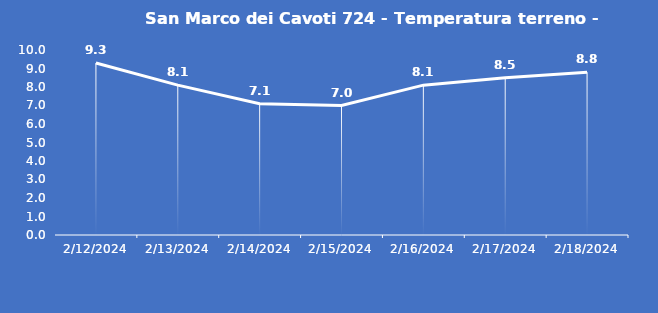
| Category | San Marco dei Cavoti 724 - Temperatura terreno - Grezzo (°C) |
|---|---|
| 2/12/24 | 9.3 |
| 2/13/24 | 8.1 |
| 2/14/24 | 7.1 |
| 2/15/24 | 7 |
| 2/16/24 | 8.1 |
| 2/17/24 | 8.5 |
| 2/18/24 | 8.8 |